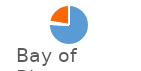
| Category | BoBiscay & Iberia |
|---|---|
| 0 | 146721 |
| 1 | 3412 |
| 2 | 43232 |